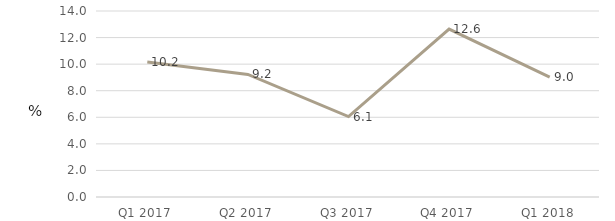
| Category | General government |
|---|---|
| Q1 2017 | 10.158 |
| Q2 2017 | 9.226 |
| Q3 2017 | 6.056 |
| Q4 2017 | 12.637 |
| Q1 2018 | 9.019 |